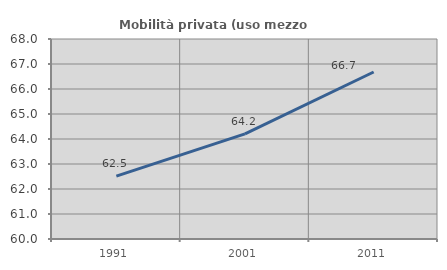
| Category | Mobilità privata (uso mezzo privato) |
|---|---|
| 1991.0 | 62.513 |
| 2001.0 | 64.207 |
| 2011.0 | 66.68 |